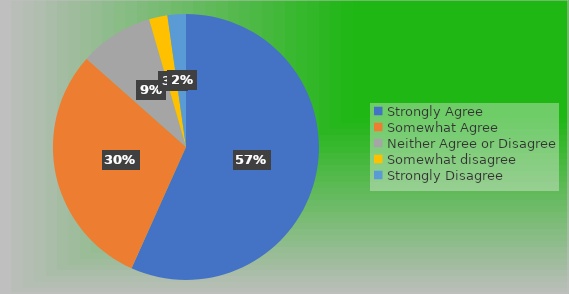
| Category | Series 0 |
|---|---|
| Strongly Agree | 76 |
| Somewhat Agree | 40 |
| Neither Agree or Disagree | 12 |
| Somewhat disagree | 3 |
| Strongly Disagree | 3 |